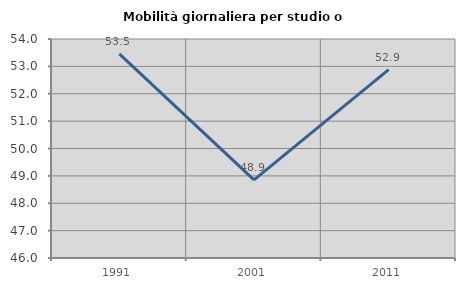
| Category | Mobilità giornaliera per studio o lavoro |
|---|---|
| 1991.0 | 53.455 |
| 2001.0 | 48.852 |
| 2011.0 | 52.882 |